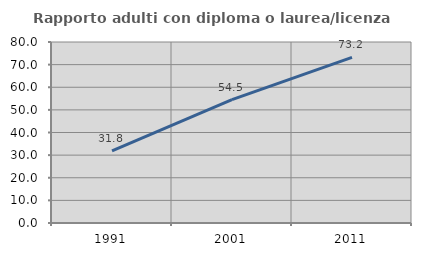
| Category | Rapporto adulti con diploma o laurea/licenza media  |
|---|---|
| 1991.0 | 31.847 |
| 2001.0 | 54.545 |
| 2011.0 | 73.232 |